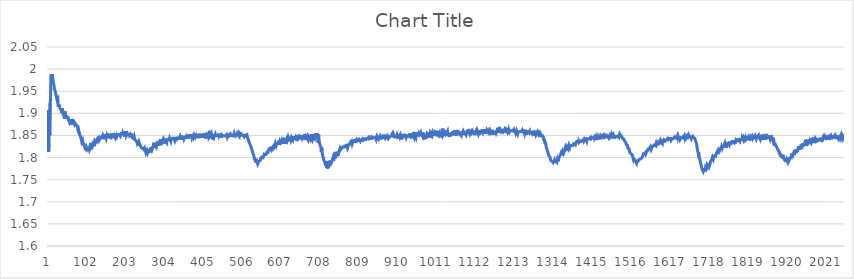
| Category | Series 0 |
|---|---|
| 0 | 1.908 |
| 1 | 1.812 |
| 2 | 1.828 |
| 3 | 1.875 |
| 4 | 1.85 |
| 5 | 1.924 |
| 6 | 1.931 |
| 7 | 1.984 |
| 8 | 1.988 |
| 9 | 1.983 |
| 10 | 1.988 |
| 11 | 1.983 |
| 12 | 1.978 |
| 13 | 1.972 |
| 14 | 1.973 |
| 15 | 1.963 |
| 16 | 1.956 |
| 17 | 1.954 |
| 18 | 1.951 |
| 19 | 1.947 |
| 20 | 1.942 |
| 21 | 1.94 |
| 22 | 1.934 |
| 23 | 1.931 |
| 24 | 1.931 |
| 25 | 1.933 |
| 26 | 1.915 |
| 27 | 1.92 |
| 28 | 1.922 |
| 29 | 1.916 |
| 30 | 1.916 |
| 31 | 1.911 |
| 32 | 1.909 |
| 33 | 1.91 |
| 34 | 1.907 |
| 35 | 1.908 |
| 36 | 1.901 |
| 37 | 1.911 |
| 38 | 1.9 |
| 39 | 1.901 |
| 40 | 1.9 |
| 41 | 1.894 |
| 42 | 1.888 |
| 43 | 1.904 |
| 44 | 1.9 |
| 45 | 1.902 |
| 46 | 1.891 |
| 47 | 1.891 |
| 48 | 1.891 |
| 49 | 1.892 |
| 50 | 1.887 |
| 51 | 1.892 |
| 52 | 1.891 |
| 53 | 1.884 |
| 54 | 1.886 |
| 55 | 1.881 |
| 56 | 1.878 |
| 57 | 1.878 |
| 58 | 1.881 |
| 59 | 1.887 |
| 60 | 1.887 |
| 61 | 1.875 |
| 62 | 1.876 |
| 63 | 1.887 |
| 64 | 1.884 |
| 65 | 1.881 |
| 66 | 1.88 |
| 67 | 1.879 |
| 68 | 1.876 |
| 69 | 1.879 |
| 70 | 1.88 |
| 71 | 1.876 |
| 72 | 1.874 |
| 73 | 1.873 |
| 74 | 1.873 |
| 75 | 1.871 |
| 76 | 1.87 |
| 77 | 1.862 |
| 78 | 1.86 |
| 79 | 1.862 |
| 80 | 1.858 |
| 81 | 1.857 |
| 82 | 1.852 |
| 83 | 1.85 |
| 84 | 1.846 |
| 85 | 1.843 |
| 86 | 1.841 |
| 87 | 1.836 |
| 88 | 1.834 |
| 89 | 1.839 |
| 90 | 1.837 |
| 91 | 1.828 |
| 92 | 1.832 |
| 93 | 1.828 |
| 94 | 1.826 |
| 95 | 1.826 |
| 96 | 1.82 |
| 97 | 1.82 |
| 98 | 1.82 |
| 99 | 1.817 |
| 100 | 1.821 |
| 101 | 1.819 |
| 102 | 1.817 |
| 103 | 1.82 |
| 104 | 1.818 |
| 105 | 1.819 |
| 106 | 1.822 |
| 107 | 1.818 |
| 108 | 1.82 |
| 109 | 1.826 |
| 110 | 1.833 |
| 111 | 1.818 |
| 112 | 1.827 |
| 113 | 1.83 |
| 114 | 1.833 |
| 115 | 1.824 |
| 116 | 1.828 |
| 117 | 1.836 |
| 118 | 1.832 |
| 119 | 1.833 |
| 120 | 1.837 |
| 121 | 1.836 |
| 122 | 1.833 |
| 123 | 1.837 |
| 124 | 1.836 |
| 125 | 1.839 |
| 126 | 1.839 |
| 127 | 1.842 |
| 128 | 1.839 |
| 129 | 1.84 |
| 130 | 1.837 |
| 131 | 1.844 |
| 132 | 1.84 |
| 133 | 1.84 |
| 134 | 1.843 |
| 135 | 1.845 |
| 136 | 1.844 |
| 137 | 1.846 |
| 138 | 1.846 |
| 139 | 1.847 |
| 140 | 1.849 |
| 141 | 1.846 |
| 142 | 1.842 |
| 143 | 1.848 |
| 144 | 1.846 |
| 145 | 1.844 |
| 146 | 1.852 |
| 147 | 1.849 |
| 148 | 1.849 |
| 149 | 1.849 |
| 150 | 1.843 |
| 151 | 1.847 |
| 152 | 1.85 |
| 153 | 1.848 |
| 154 | 1.854 |
| 155 | 1.853 |
| 156 | 1.847 |
| 157 | 1.845 |
| 158 | 1.847 |
| 159 | 1.846 |
| 160 | 1.844 |
| 161 | 1.845 |
| 162 | 1.845 |
| 163 | 1.85 |
| 164 | 1.851 |
| 165 | 1.85 |
| 166 | 1.848 |
| 167 | 1.852 |
| 168 | 1.853 |
| 169 | 1.85 |
| 170 | 1.853 |
| 171 | 1.85 |
| 172 | 1.85 |
| 173 | 1.846 |
| 174 | 1.854 |
| 175 | 1.848 |
| 176 | 1.849 |
| 177 | 1.851 |
| 178 | 1.848 |
| 179 | 1.851 |
| 180 | 1.853 |
| 181 | 1.849 |
| 182 | 1.852 |
| 183 | 1.851 |
| 184 | 1.85 |
| 185 | 1.851 |
| 186 | 1.852 |
| 187 | 1.848 |
| 188 | 1.851 |
| 189 | 1.856 |
| 190 | 1.851 |
| 191 | 1.858 |
| 192 | 1.852 |
| 193 | 1.856 |
| 194 | 1.856 |
| 195 | 1.851 |
| 196 | 1.856 |
| 197 | 1.85 |
| 198 | 1.847 |
| 199 | 1.86 |
| 200 | 1.852 |
| 201 | 1.856 |
| 202 | 1.86 |
| 203 | 1.85 |
| 204 | 1.849 |
| 205 | 1.853 |
| 206 | 1.853 |
| 207 | 1.849 |
| 208 | 1.856 |
| 209 | 1.85 |
| 210 | 1.856 |
| 211 | 1.851 |
| 212 | 1.852 |
| 213 | 1.853 |
| 214 | 1.855 |
| 215 | 1.85 |
| 216 | 1.854 |
| 217 | 1.848 |
| 218 | 1.849 |
| 219 | 1.849 |
| 220 | 1.848 |
| 221 | 1.841 |
| 222 | 1.842 |
| 223 | 1.847 |
| 224 | 1.843 |
| 225 | 1.84 |
| 226 | 1.84 |
| 227 | 1.838 |
| 228 | 1.837 |
| 229 | 1.839 |
| 230 | 1.835 |
| 231 | 1.832 |
| 232 | 1.834 |
| 233 | 1.834 |
| 234 | 1.836 |
| 235 | 1.831 |
| 236 | 1.827 |
| 237 | 1.831 |
| 238 | 1.829 |
| 239 | 1.828 |
| 240 | 1.825 |
| 241 | 1.822 |
| 242 | 1.824 |
| 243 | 1.822 |
| 244 | 1.821 |
| 245 | 1.822 |
| 246 | 1.821 |
| 247 | 1.819 |
| 248 | 1.821 |
| 249 | 1.822 |
| 250 | 1.814 |
| 251 | 1.818 |
| 252 | 1.816 |
| 253 | 1.812 |
| 254 | 1.816 |
| 255 | 1.817 |
| 256 | 1.815 |
| 257 | 1.81 |
| 258 | 1.814 |
| 259 | 1.812 |
| 260 | 1.813 |
| 261 | 1.814 |
| 262 | 1.82 |
| 263 | 1.811 |
| 264 | 1.813 |
| 265 | 1.819 |
| 266 | 1.819 |
| 267 | 1.817 |
| 268 | 1.817 |
| 269 | 1.824 |
| 270 | 1.819 |
| 271 | 1.821 |
| 272 | 1.824 |
| 273 | 1.829 |
| 274 | 1.833 |
| 275 | 1.823 |
| 276 | 1.83 |
| 277 | 1.827 |
| 278 | 1.826 |
| 279 | 1.829 |
| 280 | 1.823 |
| 281 | 1.828 |
| 282 | 1.836 |
| 283 | 1.831 |
| 284 | 1.834 |
| 285 | 1.827 |
| 286 | 1.838 |
| 287 | 1.827 |
| 288 | 1.83 |
| 289 | 1.83 |
| 290 | 1.831 |
| 291 | 1.842 |
| 292 | 1.828 |
| 293 | 1.831 |
| 294 | 1.84 |
| 295 | 1.835 |
| 296 | 1.833 |
| 297 | 1.838 |
| 298 | 1.841 |
| 299 | 1.837 |
| 300 | 1.832 |
| 301 | 1.835 |
| 302 | 1.838 |
| 303 | 1.833 |
| 304 | 1.838 |
| 305 | 1.836 |
| 306 | 1.838 |
| 307 | 1.834 |
| 308 | 1.84 |
| 309 | 1.842 |
| 310 | 1.842 |
| 311 | 1.842 |
| 312 | 1.84 |
| 313 | 1.842 |
| 314 | 1.84 |
| 315 | 1.844 |
| 316 | 1.844 |
| 317 | 1.844 |
| 318 | 1.837 |
| 319 | 1.842 |
| 320 | 1.842 |
| 321 | 1.842 |
| 322 | 1.843 |
| 323 | 1.845 |
| 324 | 1.843 |
| 325 | 1.844 |
| 326 | 1.843 |
| 327 | 1.841 |
| 328 | 1.839 |
| 329 | 1.842 |
| 330 | 1.842 |
| 331 | 1.842 |
| 332 | 1.84 |
| 333 | 1.844 |
| 334 | 1.847 |
| 335 | 1.843 |
| 336 | 1.844 |
| 337 | 1.844 |
| 338 | 1.844 |
| 339 | 1.841 |
| 340 | 1.844 |
| 341 | 1.845 |
| 342 | 1.848 |
| 343 | 1.849 |
| 344 | 1.842 |
| 345 | 1.85 |
| 346 | 1.846 |
| 347 | 1.848 |
| 348 | 1.84 |
| 349 | 1.845 |
| 350 | 1.849 |
| 351 | 1.848 |
| 352 | 1.842 |
| 353 | 1.84 |
| 354 | 1.843 |
| 355 | 1.849 |
| 356 | 1.843 |
| 357 | 1.844 |
| 358 | 1.847 |
| 359 | 1.848 |
| 360 | 1.843 |
| 361 | 1.85 |
| 362 | 1.849 |
| 363 | 1.843 |
| 364 | 1.852 |
| 365 | 1.846 |
| 366 | 1.849 |
| 367 | 1.849 |
| 368 | 1.849 |
| 369 | 1.849 |
| 370 | 1.853 |
| 371 | 1.848 |
| 372 | 1.851 |
| 373 | 1.844 |
| 374 | 1.846 |
| 375 | 1.846 |
| 376 | 1.849 |
| 377 | 1.846 |
| 378 | 1.849 |
| 379 | 1.846 |
| 380 | 1.843 |
| 381 | 1.851 |
| 382 | 1.847 |
| 383 | 1.847 |
| 384 | 1.851 |
| 385 | 1.853 |
| 386 | 1.848 |
| 387 | 1.848 |
| 388 | 1.85 |
| 389 | 1.847 |
| 390 | 1.853 |
| 391 | 1.844 |
| 392 | 1.854 |
| 393 | 1.844 |
| 394 | 1.851 |
| 395 | 1.845 |
| 396 | 1.853 |
| 397 | 1.849 |
| 398 | 1.849 |
| 399 | 1.847 |
| 400 | 1.849 |
| 401 | 1.845 |
| 402 | 1.85 |
| 403 | 1.85 |
| 404 | 1.851 |
| 405 | 1.848 |
| 406 | 1.855 |
| 407 | 1.855 |
| 408 | 1.844 |
| 409 | 1.848 |
| 410 | 1.849 |
| 411 | 1.852 |
| 412 | 1.852 |
| 413 | 1.85 |
| 414 | 1.85 |
| 415 | 1.853 |
| 416 | 1.847 |
| 417 | 1.845 |
| 418 | 1.847 |
| 419 | 1.853 |
| 420 | 1.849 |
| 421 | 1.851 |
| 422 | 1.85 |
| 423 | 1.854 |
| 424 | 1.848 |
| 425 | 1.852 |
| 426 | 1.85 |
| 427 | 1.841 |
| 428 | 1.852 |
| 429 | 1.853 |
| 430 | 1.847 |
| 431 | 1.85 |
| 432 | 1.849 |
| 433 | 1.853 |
| 434 | 1.849 |
| 435 | 1.85 |
| 436 | 1.847 |
| 437 | 1.85 |
| 438 | 1.851 |
| 439 | 1.852 |
| 440 | 1.851 |
| 441 | 1.848 |
| 442 | 1.853 |
| 443 | 1.848 |
| 444 | 1.849 |
| 445 | 1.851 |
| 446 | 1.851 |
| 447 | 1.852 |
| 448 | 1.852 |
| 449 | 1.845 |
| 450 | 1.849 |
| 451 | 1.851 |
| 452 | 1.85 |
| 453 | 1.85 |
| 454 | 1.851 |
| 455 | 1.85 |
| 456 | 1.849 |
| 457 | 1.851 |
| 458 | 1.85 |
| 459 | 1.849 |
| 460 | 1.848 |
| 461 | 1.851 |
| 462 | 1.852 |
| 463 | 1.85 |
| 464 | 1.846 |
| 465 | 1.847 |
| 466 | 1.851 |
| 467 | 1.851 |
| 468 | 1.851 |
| 469 | 1.852 |
| 470 | 1.85 |
| 471 | 1.849 |
| 472 | 1.852 |
| 473 | 1.847 |
| 474 | 1.85 |
| 475 | 1.851 |
| 476 | 1.852 |
| 477 | 1.85 |
| 478 | 1.852 |
| 479 | 1.848 |
| 480 | 1.849 |
| 481 | 1.852 |
| 482 | 1.855 |
| 483 | 1.852 |
| 484 | 1.85 |
| 485 | 1.85 |
| 486 | 1.849 |
| 487 | 1.85 |
| 488 | 1.851 |
| 489 | 1.853 |
| 490 | 1.849 |
| 491 | 1.853 |
| 492 | 1.851 |
| 493 | 1.85 |
| 494 | 1.852 |
| 495 | 1.848 |
| 496 | 1.854 |
| 497 | 1.853 |
| 498 | 1.851 |
| 499 | 1.853 |
| 500 | 1.854 |
| 501 | 1.854 |
| 502 | 1.854 |
| 503 | 1.85 |
| 504 | 1.851 |
| 505 | 1.85 |
| 506 | 1.85 |
| 507 | 1.85 |
| 508 | 1.848 |
| 509 | 1.85 |
| 510 | 1.851 |
| 511 | 1.85 |
| 512 | 1.851 |
| 513 | 1.852 |
| 514 | 1.851 |
| 515 | 1.852 |
| 516 | 1.846 |
| 517 | 1.845 |
| 518 | 1.847 |
| 519 | 1.84 |
| 520 | 1.838 |
| 521 | 1.84 |
| 522 | 1.833 |
| 523 | 1.832 |
| 524 | 1.831 |
| 525 | 1.826 |
| 526 | 1.825 |
| 527 | 1.821 |
| 528 | 1.82 |
| 529 | 1.815 |
| 530 | 1.813 |
| 531 | 1.809 |
| 532 | 1.807 |
| 533 | 1.804 |
| 534 | 1.8 |
| 535 | 1.796 |
| 536 | 1.796 |
| 537 | 1.792 |
| 538 | 1.794 |
| 539 | 1.791 |
| 540 | 1.794 |
| 541 | 1.794 |
| 542 | 1.794 |
| 543 | 1.785 |
| 544 | 1.785 |
| 545 | 1.79 |
| 546 | 1.79 |
| 547 | 1.792 |
| 548 | 1.79 |
| 549 | 1.794 |
| 550 | 1.794 |
| 551 | 1.798 |
| 552 | 1.799 |
| 553 | 1.796 |
| 554 | 1.801 |
| 555 | 1.8 |
| 556 | 1.8 |
| 557 | 1.8 |
| 558 | 1.8 |
| 559 | 1.801 |
| 560 | 1.808 |
| 561 | 1.807 |
| 562 | 1.807 |
| 563 | 1.807 |
| 564 | 1.807 |
| 565 | 1.807 |
| 566 | 1.808 |
| 567 | 1.809 |
| 568 | 1.814 |
| 569 | 1.81 |
| 570 | 1.814 |
| 571 | 1.816 |
| 572 | 1.819 |
| 573 | 1.819 |
| 574 | 1.818 |
| 575 | 1.821 |
| 576 | 1.82 |
| 577 | 1.819 |
| 578 | 1.824 |
| 579 | 1.822 |
| 580 | 1.819 |
| 581 | 1.821 |
| 582 | 1.823 |
| 583 | 1.823 |
| 584 | 1.826 |
| 585 | 1.823 |
| 586 | 1.825 |
| 587 | 1.824 |
| 588 | 1.829 |
| 589 | 1.832 |
| 590 | 1.833 |
| 591 | 1.827 |
| 592 | 1.826 |
| 593 | 1.833 |
| 594 | 1.829 |
| 595 | 1.835 |
| 596 | 1.831 |
| 597 | 1.828 |
| 598 | 1.836 |
| 599 | 1.839 |
| 600 | 1.829 |
| 601 | 1.837 |
| 602 | 1.836 |
| 603 | 1.834 |
| 604 | 1.836 |
| 605 | 1.838 |
| 606 | 1.834 |
| 607 | 1.838 |
| 608 | 1.831 |
| 609 | 1.845 |
| 610 | 1.84 |
| 611 | 1.838 |
| 612 | 1.84 |
| 613 | 1.835 |
| 614 | 1.831 |
| 615 | 1.837 |
| 616 | 1.834 |
| 617 | 1.841 |
| 618 | 1.842 |
| 619 | 1.84 |
| 620 | 1.846 |
| 621 | 1.84 |
| 622 | 1.84 |
| 623 | 1.844 |
| 624 | 1.842 |
| 625 | 1.841 |
| 626 | 1.837 |
| 627 | 1.843 |
| 628 | 1.841 |
| 629 | 1.846 |
| 630 | 1.84 |
| 631 | 1.842 |
| 632 | 1.843 |
| 633 | 1.842 |
| 634 | 1.84 |
| 635 | 1.848 |
| 636 | 1.842 |
| 637 | 1.847 |
| 638 | 1.844 |
| 639 | 1.84 |
| 640 | 1.843 |
| 641 | 1.843 |
| 642 | 1.847 |
| 643 | 1.846 |
| 644 | 1.844 |
| 645 | 1.837 |
| 646 | 1.848 |
| 647 | 1.84 |
| 648 | 1.84 |
| 649 | 1.846 |
| 650 | 1.852 |
| 651 | 1.846 |
| 652 | 1.842 |
| 653 | 1.85 |
| 654 | 1.847 |
| 655 | 1.848 |
| 656 | 1.846 |
| 657 | 1.843 |
| 658 | 1.846 |
| 659 | 1.847 |
| 660 | 1.846 |
| 661 | 1.844 |
| 662 | 1.85 |
| 663 | 1.847 |
| 664 | 1.84 |
| 665 | 1.853 |
| 666 | 1.855 |
| 667 | 1.847 |
| 668 | 1.846 |
| 669 | 1.846 |
| 670 | 1.844 |
| 671 | 1.845 |
| 672 | 1.846 |
| 673 | 1.84 |
| 674 | 1.849 |
| 675 | 1.847 |
| 676 | 1.846 |
| 677 | 1.848 |
| 678 | 1.846 |
| 679 | 1.842 |
| 680 | 1.844 |
| 681 | 1.852 |
| 682 | 1.846 |
| 683 | 1.853 |
| 684 | 1.842 |
| 685 | 1.84 |
| 686 | 1.842 |
| 687 | 1.853 |
| 688 | 1.849 |
| 689 | 1.851 |
| 690 | 1.847 |
| 691 | 1.844 |
| 692 | 1.847 |
| 693 | 1.855 |
| 694 | 1.853 |
| 695 | 1.846 |
| 696 | 1.845 |
| 697 | 1.855 |
| 698 | 1.848 |
| 699 | 1.852 |
| 700 | 1.834 |
| 701 | 1.852 |
| 702 | 1.834 |
| 703 | 1.834 |
| 704 | 1.831 |
| 705 | 1.826 |
| 706 | 1.827 |
| 707 | 1.824 |
| 708 | 1.812 |
| 709 | 1.822 |
| 710 | 1.814 |
| 711 | 1.805 |
| 712 | 1.805 |
| 713 | 1.801 |
| 714 | 1.796 |
| 715 | 1.797 |
| 716 | 1.794 |
| 717 | 1.79 |
| 718 | 1.788 |
| 719 | 1.789 |
| 720 | 1.781 |
| 721 | 1.785 |
| 722 | 1.777 |
| 723 | 1.792 |
| 724 | 1.775 |
| 725 | 1.778 |
| 726 | 1.783 |
| 727 | 1.778 |
| 728 | 1.784 |
| 729 | 1.781 |
| 730 | 1.793 |
| 731 | 1.784 |
| 732 | 1.787 |
| 733 | 1.789 |
| 734 | 1.794 |
| 735 | 1.791 |
| 736 | 1.789 |
| 737 | 1.79 |
| 738 | 1.798 |
| 739 | 1.802 |
| 740 | 1.8 |
| 741 | 1.799 |
| 742 | 1.806 |
| 743 | 1.797 |
| 744 | 1.813 |
| 745 | 1.807 |
| 746 | 1.807 |
| 747 | 1.804 |
| 748 | 1.804 |
| 749 | 1.804 |
| 750 | 1.807 |
| 751 | 1.804 |
| 752 | 1.814 |
| 753 | 1.812 |
| 754 | 1.814 |
| 755 | 1.814 |
| 756 | 1.82 |
| 757 | 1.816 |
| 758 | 1.817 |
| 759 | 1.819 |
| 760 | 1.817 |
| 761 | 1.818 |
| 762 | 1.823 |
| 763 | 1.824 |
| 764 | 1.822 |
| 765 | 1.823 |
| 766 | 1.822 |
| 767 | 1.825 |
| 768 | 1.824 |
| 769 | 1.828 |
| 770 | 1.822 |
| 771 | 1.827 |
| 772 | 1.827 |
| 773 | 1.825 |
| 774 | 1.828 |
| 775 | 1.828 |
| 776 | 1.822 |
| 777 | 1.824 |
| 778 | 1.828 |
| 779 | 1.83 |
| 780 | 1.829 |
| 781 | 1.83 |
| 782 | 1.832 |
| 783 | 1.831 |
| 784 | 1.835 |
| 785 | 1.835 |
| 786 | 1.832 |
| 787 | 1.834 |
| 788 | 1.83 |
| 789 | 1.833 |
| 790 | 1.839 |
| 791 | 1.833 |
| 792 | 1.838 |
| 793 | 1.839 |
| 794 | 1.838 |
| 795 | 1.839 |
| 796 | 1.833 |
| 797 | 1.837 |
| 798 | 1.837 |
| 799 | 1.84 |
| 800 | 1.837 |
| 801 | 1.838 |
| 802 | 1.838 |
| 803 | 1.838 |
| 804 | 1.839 |
| 805 | 1.839 |
| 806 | 1.841 |
| 807 | 1.843 |
| 808 | 1.842 |
| 809 | 1.837 |
| 810 | 1.839 |
| 811 | 1.84 |
| 812 | 1.838 |
| 813 | 1.84 |
| 814 | 1.839 |
| 815 | 1.842 |
| 816 | 1.84 |
| 817 | 1.839 |
| 818 | 1.841 |
| 819 | 1.841 |
| 820 | 1.842 |
| 821 | 1.841 |
| 822 | 1.84 |
| 823 | 1.842 |
| 824 | 1.845 |
| 825 | 1.842 |
| 826 | 1.844 |
| 827 | 1.841 |
| 828 | 1.844 |
| 829 | 1.844 |
| 830 | 1.844 |
| 831 | 1.846 |
| 832 | 1.842 |
| 833 | 1.844 |
| 834 | 1.842 |
| 835 | 1.844 |
| 836 | 1.844 |
| 837 | 1.844 |
| 838 | 1.843 |
| 839 | 1.846 |
| 840 | 1.846 |
| 841 | 1.847 |
| 842 | 1.844 |
| 843 | 1.844 |
| 844 | 1.846 |
| 845 | 1.845 |
| 846 | 1.845 |
| 847 | 1.845 |
| 848 | 1.846 |
| 849 | 1.846 |
| 850 | 1.841 |
| 851 | 1.844 |
| 852 | 1.842 |
| 853 | 1.847 |
| 854 | 1.846 |
| 855 | 1.846 |
| 856 | 1.842 |
| 857 | 1.846 |
| 858 | 1.85 |
| 859 | 1.842 |
| 860 | 1.848 |
| 861 | 1.841 |
| 862 | 1.848 |
| 863 | 1.848 |
| 864 | 1.845 |
| 865 | 1.846 |
| 866 | 1.846 |
| 867 | 1.848 |
| 868 | 1.846 |
| 869 | 1.847 |
| 870 | 1.845 |
| 871 | 1.848 |
| 872 | 1.847 |
| 873 | 1.844 |
| 874 | 1.845 |
| 875 | 1.845 |
| 876 | 1.852 |
| 877 | 1.846 |
| 878 | 1.846 |
| 879 | 1.848 |
| 880 | 1.843 |
| 881 | 1.847 |
| 882 | 1.847 |
| 883 | 1.844 |
| 884 | 1.844 |
| 885 | 1.844 |
| 886 | 1.847 |
| 887 | 1.846 |
| 888 | 1.847 |
| 889 | 1.849 |
| 890 | 1.851 |
| 891 | 1.85 |
| 892 | 1.854 |
| 893 | 1.847 |
| 894 | 1.846 |
| 895 | 1.851 |
| 896 | 1.847 |
| 897 | 1.846 |
| 898 | 1.849 |
| 899 | 1.847 |
| 900 | 1.848 |
| 901 | 1.848 |
| 902 | 1.847 |
| 903 | 1.849 |
| 904 | 1.852 |
| 905 | 1.849 |
| 906 | 1.846 |
| 907 | 1.847 |
| 908 | 1.845 |
| 909 | 1.847 |
| 910 | 1.848 |
| 911 | 1.848 |
| 912 | 1.851 |
| 913 | 1.845 |
| 914 | 1.846 |
| 915 | 1.848 |
| 916 | 1.85 |
| 917 | 1.841 |
| 918 | 1.848 |
| 919 | 1.847 |
| 920 | 1.848 |
| 921 | 1.848 |
| 922 | 1.854 |
| 923 | 1.846 |
| 924 | 1.849 |
| 925 | 1.851 |
| 926 | 1.85 |
| 927 | 1.85 |
| 928 | 1.846 |
| 929 | 1.849 |
| 930 | 1.85 |
| 931 | 1.851 |
| 932 | 1.849 |
| 933 | 1.851 |
| 934 | 1.85 |
| 935 | 1.849 |
| 936 | 1.846 |
| 937 | 1.854 |
| 938 | 1.853 |
| 939 | 1.846 |
| 940 | 1.849 |
| 941 | 1.844 |
| 942 | 1.849 |
| 943 | 1.846 |
| 944 | 1.854 |
| 945 | 1.852 |
| 946 | 1.848 |
| 947 | 1.858 |
| 948 | 1.848 |
| 949 | 1.846 |
| 950 | 1.85 |
| 951 | 1.852 |
| 952 | 1.851 |
| 953 | 1.846 |
| 954 | 1.856 |
| 955 | 1.851 |
| 956 | 1.852 |
| 957 | 1.856 |
| 958 | 1.848 |
| 959 | 1.85 |
| 960 | 1.852 |
| 961 | 1.855 |
| 962 | 1.853 |
| 963 | 1.852 |
| 964 | 1.854 |
| 965 | 1.856 |
| 966 | 1.85 |
| 967 | 1.854 |
| 968 | 1.854 |
| 969 | 1.852 |
| 970 | 1.849 |
| 971 | 1.856 |
| 972 | 1.856 |
| 973 | 1.852 |
| 974 | 1.841 |
| 975 | 1.851 |
| 976 | 1.851 |
| 977 | 1.843 |
| 978 | 1.849 |
| 979 | 1.843 |
| 980 | 1.847 |
| 981 | 1.848 |
| 982 | 1.854 |
| 983 | 1.854 |
| 984 | 1.852 |
| 985 | 1.85 |
| 986 | 1.845 |
| 987 | 1.857 |
| 988 | 1.853 |
| 989 | 1.85 |
| 990 | 1.846 |
| 991 | 1.855 |
| 992 | 1.854 |
| 993 | 1.856 |
| 994 | 1.85 |
| 995 | 1.855 |
| 996 | 1.857 |
| 997 | 1.854 |
| 998 | 1.857 |
| 999 | 1.849 |
| 1000 | 1.849 |
| 1001 | 1.855 |
| 1002 | 1.852 |
| 1003 | 1.85 |
| 1004 | 1.848 |
| 1005 | 1.861 |
| 1006 | 1.849 |
| 1007 | 1.859 |
| 1008 | 1.855 |
| 1009 | 1.854 |
| 1010 | 1.848 |
| 1011 | 1.854 |
| 1012 | 1.852 |
| 1013 | 1.854 |
| 1014 | 1.857 |
| 1015 | 1.85 |
| 1016 | 1.85 |
| 1017 | 1.853 |
| 1018 | 1.858 |
| 1019 | 1.846 |
| 1020 | 1.85 |
| 1021 | 1.854 |
| 1022 | 1.856 |
| 1023 | 1.866 |
| 1024 | 1.85 |
| 1025 | 1.852 |
| 1026 | 1.852 |
| 1027 | 1.854 |
| 1028 | 1.861 |
| 1029 | 1.851 |
| 1030 | 1.85 |
| 1031 | 1.859 |
| 1032 | 1.855 |
| 1033 | 1.857 |
| 1034 | 1.854 |
| 1035 | 1.86 |
| 1036 | 1.851 |
| 1037 | 1.855 |
| 1038 | 1.849 |
| 1039 | 1.854 |
| 1040 | 1.851 |
| 1041 | 1.846 |
| 1042 | 1.855 |
| 1043 | 1.85 |
| 1044 | 1.855 |
| 1045 | 1.857 |
| 1046 | 1.857 |
| 1047 | 1.856 |
| 1048 | 1.853 |
| 1049 | 1.855 |
| 1050 | 1.854 |
| 1051 | 1.853 |
| 1052 | 1.85 |
| 1053 | 1.861 |
| 1054 | 1.852 |
| 1055 | 1.861 |
| 1056 | 1.855 |
| 1057 | 1.86 |
| 1058 | 1.85 |
| 1059 | 1.852 |
| 1060 | 1.857 |
| 1061 | 1.859 |
| 1062 | 1.86 |
| 1063 | 1.859 |
| 1064 | 1.858 |
| 1065 | 1.856 |
| 1066 | 1.857 |
| 1067 | 1.853 |
| 1068 | 1.852 |
| 1069 | 1.858 |
| 1070 | 1.852 |
| 1071 | 1.856 |
| 1072 | 1.853 |
| 1073 | 1.856 |
| 1074 | 1.858 |
| 1075 | 1.859 |
| 1076 | 1.852 |
| 1077 | 1.858 |
| 1078 | 1.857 |
| 1079 | 1.858 |
| 1080 | 1.856 |
| 1081 | 1.854 |
| 1082 | 1.856 |
| 1083 | 1.851 |
| 1084 | 1.855 |
| 1085 | 1.853 |
| 1086 | 1.86 |
| 1087 | 1.861 |
| 1088 | 1.86 |
| 1089 | 1.861 |
| 1090 | 1.859 |
| 1091 | 1.857 |
| 1092 | 1.855 |
| 1093 | 1.86 |
| 1094 | 1.857 |
| 1095 | 1.858 |
| 1096 | 1.86 |
| 1097 | 1.861 |
| 1098 | 1.856 |
| 1099 | 1.854 |
| 1100 | 1.86 |
| 1101 | 1.859 |
| 1102 | 1.855 |
| 1103 | 1.86 |
| 1104 | 1.854 |
| 1105 | 1.856 |
| 1106 | 1.854 |
| 1107 | 1.853 |
| 1108 | 1.856 |
| 1109 | 1.861 |
| 1110 | 1.861 |
| 1111 | 1.864 |
| 1112 | 1.861 |
| 1113 | 1.859 |
| 1114 | 1.86 |
| 1115 | 1.853 |
| 1116 | 1.852 |
| 1117 | 1.859 |
| 1118 | 1.852 |
| 1119 | 1.862 |
| 1120 | 1.86 |
| 1121 | 1.86 |
| 1122 | 1.858 |
| 1123 | 1.86 |
| 1124 | 1.859 |
| 1125 | 1.858 |
| 1126 | 1.856 |
| 1127 | 1.86 |
| 1128 | 1.857 |
| 1129 | 1.863 |
| 1130 | 1.854 |
| 1131 | 1.864 |
| 1132 | 1.858 |
| 1133 | 1.863 |
| 1134 | 1.854 |
| 1135 | 1.857 |
| 1136 | 1.86 |
| 1137 | 1.863 |
| 1138 | 1.861 |
| 1139 | 1.86 |
| 1140 | 1.86 |
| 1141 | 1.857 |
| 1142 | 1.858 |
| 1143 | 1.862 |
| 1144 | 1.862 |
| 1145 | 1.858 |
| 1146 | 1.86 |
| 1147 | 1.858 |
| 1148 | 1.856 |
| 1149 | 1.859 |
| 1150 | 1.857 |
| 1151 | 1.86 |
| 1152 | 1.863 |
| 1153 | 1.852 |
| 1154 | 1.857 |
| 1155 | 1.856 |
| 1156 | 1.858 |
| 1157 | 1.856 |
| 1158 | 1.857 |
| 1159 | 1.857 |
| 1160 | 1.858 |
| 1161 | 1.855 |
| 1162 | 1.858 |
| 1163 | 1.856 |
| 1164 | 1.858 |
| 1165 | 1.867 |
| 1166 | 1.858 |
| 1167 | 1.864 |
| 1168 | 1.856 |
| 1169 | 1.866 |
| 1170 | 1.869 |
| 1171 | 1.859 |
| 1172 | 1.862 |
| 1173 | 1.863 |
| 1174 | 1.858 |
| 1175 | 1.86 |
| 1176 | 1.86 |
| 1177 | 1.861 |
| 1178 | 1.863 |
| 1179 | 1.858 |
| 1180 | 1.859 |
| 1181 | 1.86 |
| 1182 | 1.862 |
| 1183 | 1.856 |
| 1184 | 1.86 |
| 1185 | 1.857 |
| 1186 | 1.867 |
| 1187 | 1.857 |
| 1188 | 1.861 |
| 1189 | 1.863 |
| 1190 | 1.861 |
| 1191 | 1.856 |
| 1192 | 1.858 |
| 1193 | 1.86 |
| 1194 | 1.863 |
| 1195 | 1.861 |
| 1196 | 1.858 |
| 1197 | 1.859 |
| 1198 | 1.861 |
| 1199 | 1.863 |
| 1200 | 1.863 |
| 1201 | 1.861 |
| 1202 | 1.861 |
| 1203 | 1.86 |
| 1204 | 1.86 |
| 1205 | 1.86 |
| 1206 | 1.858 |
| 1207 | 1.864 |
| 1208 | 1.863 |
| 1209 | 1.858 |
| 1210 | 1.862 |
| 1211 | 1.863 |
| 1212 | 1.856 |
| 1213 | 1.859 |
| 1214 | 1.861 |
| 1215 | 1.858 |
| 1216 | 1.858 |
| 1217 | 1.854 |
| 1218 | 1.858 |
| 1219 | 1.856 |
| 1220 | 1.859 |
| 1221 | 1.858 |
| 1222 | 1.858 |
| 1223 | 1.856 |
| 1224 | 1.86 |
| 1225 | 1.858 |
| 1226 | 1.858 |
| 1227 | 1.858 |
| 1228 | 1.86 |
| 1229 | 1.862 |
| 1230 | 1.859 |
| 1231 | 1.859 |
| 1232 | 1.857 |
| 1233 | 1.86 |
| 1234 | 1.856 |
| 1235 | 1.854 |
| 1236 | 1.857 |
| 1237 | 1.863 |
| 1238 | 1.858 |
| 1239 | 1.855 |
| 1240 | 1.852 |
| 1241 | 1.86 |
| 1242 | 1.855 |
| 1243 | 1.861 |
| 1244 | 1.857 |
| 1245 | 1.858 |
| 1246 | 1.857 |
| 1247 | 1.855 |
| 1248 | 1.855 |
| 1249 | 1.859 |
| 1250 | 1.857 |
| 1251 | 1.856 |
| 1252 | 1.858 |
| 1253 | 1.856 |
| 1254 | 1.855 |
| 1255 | 1.853 |
| 1256 | 1.854 |
| 1257 | 1.857 |
| 1258 | 1.856 |
| 1259 | 1.854 |
| 1260 | 1.855 |
| 1261 | 1.857 |
| 1262 | 1.857 |
| 1263 | 1.852 |
| 1264 | 1.856 |
| 1265 | 1.853 |
| 1266 | 1.853 |
| 1267 | 1.853 |
| 1268 | 1.858 |
| 1269 | 1.856 |
| 1270 | 1.854 |
| 1271 | 1.853 |
| 1272 | 1.861 |
| 1273 | 1.85 |
| 1274 | 1.858 |
| 1275 | 1.85 |
| 1276 | 1.855 |
| 1277 | 1.847 |
| 1278 | 1.851 |
| 1279 | 1.847 |
| 1280 | 1.852 |
| 1281 | 1.848 |
| 1282 | 1.848 |
| 1283 | 1.847 |
| 1284 | 1.845 |
| 1285 | 1.838 |
| 1286 | 1.841 |
| 1287 | 1.837 |
| 1288 | 1.832 |
| 1289 | 1.836 |
| 1290 | 1.829 |
| 1291 | 1.824 |
| 1292 | 1.823 |
| 1293 | 1.819 |
| 1294 | 1.818 |
| 1295 | 1.813 |
| 1296 | 1.813 |
| 1297 | 1.806 |
| 1298 | 1.804 |
| 1299 | 1.806 |
| 1300 | 1.802 |
| 1301 | 1.801 |
| 1302 | 1.795 |
| 1303 | 1.793 |
| 1304 | 1.792 |
| 1305 | 1.794 |
| 1306 | 1.792 |
| 1307 | 1.791 |
| 1308 | 1.79 |
| 1309 | 1.789 |
| 1310 | 1.787 |
| 1311 | 1.787 |
| 1312 | 1.794 |
| 1313 | 1.789 |
| 1314 | 1.792 |
| 1315 | 1.792 |
| 1316 | 1.793 |
| 1317 | 1.79 |
| 1318 | 1.795 |
| 1319 | 1.793 |
| 1320 | 1.797 |
| 1321 | 1.795 |
| 1322 | 1.792 |
| 1323 | 1.796 |
| 1324 | 1.798 |
| 1325 | 1.802 |
| 1326 | 1.802 |
| 1327 | 1.8 |
| 1328 | 1.807 |
| 1329 | 1.809 |
| 1330 | 1.806 |
| 1331 | 1.81 |
| 1332 | 1.805 |
| 1333 | 1.81 |
| 1334 | 1.813 |
| 1335 | 1.811 |
| 1336 | 1.813 |
| 1337 | 1.818 |
| 1338 | 1.815 |
| 1339 | 1.816 |
| 1340 | 1.821 |
| 1341 | 1.818 |
| 1342 | 1.819 |
| 1343 | 1.82 |
| 1344 | 1.823 |
| 1345 | 1.821 |
| 1346 | 1.821 |
| 1347 | 1.823 |
| 1348 | 1.821 |
| 1349 | 1.822 |
| 1350 | 1.828 |
| 1351 | 1.828 |
| 1352 | 1.823 |
| 1353 | 1.827 |
| 1354 | 1.83 |
| 1355 | 1.826 |
| 1356 | 1.83 |
| 1357 | 1.825 |
| 1358 | 1.83 |
| 1359 | 1.826 |
| 1360 | 1.829 |
| 1361 | 1.83 |
| 1362 | 1.831 |
| 1363 | 1.833 |
| 1364 | 1.833 |
| 1365 | 1.832 |
| 1366 | 1.831 |
| 1367 | 1.83 |
| 1368 | 1.832 |
| 1369 | 1.833 |
| 1370 | 1.838 |
| 1371 | 1.834 |
| 1372 | 1.834 |
| 1373 | 1.839 |
| 1374 | 1.834 |
| 1375 | 1.837 |
| 1376 | 1.834 |
| 1377 | 1.836 |
| 1378 | 1.834 |
| 1379 | 1.837 |
| 1380 | 1.836 |
| 1381 | 1.837 |
| 1382 | 1.836 |
| 1383 | 1.837 |
| 1384 | 1.837 |
| 1385 | 1.839 |
| 1386 | 1.837 |
| 1387 | 1.84 |
| 1388 | 1.842 |
| 1389 | 1.838 |
| 1390 | 1.84 |
| 1391 | 1.841 |
| 1392 | 1.84 |
| 1393 | 1.841 |
| 1394 | 1.842 |
| 1395 | 1.841 |
| 1396 | 1.838 |
| 1397 | 1.842 |
| 1398 | 1.841 |
| 1399 | 1.841 |
| 1400 | 1.842 |
| 1401 | 1.842 |
| 1402 | 1.84 |
| 1403 | 1.843 |
| 1404 | 1.845 |
| 1405 | 1.844 |
| 1406 | 1.845 |
| 1407 | 1.842 |
| 1408 | 1.842 |
| 1409 | 1.844 |
| 1410 | 1.845 |
| 1411 | 1.846 |
| 1412 | 1.844 |
| 1413 | 1.844 |
| 1414 | 1.843 |
| 1415 | 1.846 |
| 1416 | 1.843 |
| 1417 | 1.843 |
| 1418 | 1.846 |
| 1419 | 1.843 |
| 1420 | 1.841 |
| 1421 | 1.843 |
| 1422 | 1.842 |
| 1423 | 1.847 |
| 1424 | 1.844 |
| 1425 | 1.842 |
| 1426 | 1.848 |
| 1427 | 1.843 |
| 1428 | 1.846 |
| 1429 | 1.844 |
| 1430 | 1.841 |
| 1431 | 1.847 |
| 1432 | 1.844 |
| 1433 | 1.849 |
| 1434 | 1.848 |
| 1435 | 1.846 |
| 1436 | 1.847 |
| 1437 | 1.845 |
| 1438 | 1.85 |
| 1439 | 1.847 |
| 1440 | 1.846 |
| 1441 | 1.846 |
| 1442 | 1.85 |
| 1443 | 1.846 |
| 1444 | 1.845 |
| 1445 | 1.847 |
| 1446 | 1.847 |
| 1447 | 1.846 |
| 1448 | 1.85 |
| 1449 | 1.849 |
| 1450 | 1.847 |
| 1451 | 1.847 |
| 1452 | 1.849 |
| 1453 | 1.844 |
| 1454 | 1.844 |
| 1455 | 1.845 |
| 1456 | 1.851 |
| 1457 | 1.849 |
| 1458 | 1.848 |
| 1459 | 1.848 |
| 1460 | 1.853 |
| 1461 | 1.849 |
| 1462 | 1.851 |
| 1463 | 1.847 |
| 1464 | 1.846 |
| 1465 | 1.85 |
| 1466 | 1.846 |
| 1467 | 1.845 |
| 1468 | 1.846 |
| 1469 | 1.846 |
| 1470 | 1.848 |
| 1471 | 1.846 |
| 1472 | 1.846 |
| 1473 | 1.848 |
| 1474 | 1.85 |
| 1475 | 1.846 |
| 1476 | 1.847 |
| 1477 | 1.845 |
| 1478 | 1.849 |
| 1479 | 1.85 |
| 1480 | 1.848 |
| 1481 | 1.851 |
| 1482 | 1.847 |
| 1483 | 1.852 |
| 1484 | 1.853 |
| 1485 | 1.85 |
| 1486 | 1.848 |
| 1487 | 1.849 |
| 1488 | 1.846 |
| 1489 | 1.843 |
| 1490 | 1.843 |
| 1491 | 1.845 |
| 1492 | 1.842 |
| 1493 | 1.84 |
| 1494 | 1.838 |
| 1495 | 1.836 |
| 1496 | 1.836 |
| 1497 | 1.834 |
| 1498 | 1.831 |
| 1499 | 1.829 |
| 1500 | 1.83 |
| 1501 | 1.828 |
| 1502 | 1.827 |
| 1503 | 1.821 |
| 1504 | 1.822 |
| 1505 | 1.821 |
| 1506 | 1.819 |
| 1507 | 1.815 |
| 1508 | 1.811 |
| 1509 | 1.812 |
| 1510 | 1.809 |
| 1511 | 1.808 |
| 1512 | 1.807 |
| 1513 | 1.81 |
| 1514 | 1.806 |
| 1515 | 1.802 |
| 1516 | 1.8 |
| 1517 | 1.796 |
| 1518 | 1.799 |
| 1519 | 1.793 |
| 1520 | 1.795 |
| 1521 | 1.793 |
| 1522 | 1.793 |
| 1523 | 1.795 |
| 1524 | 1.792 |
| 1525 | 1.787 |
| 1526 | 1.792 |
| 1527 | 1.791 |
| 1528 | 1.794 |
| 1529 | 1.792 |
| 1530 | 1.794 |
| 1531 | 1.795 |
| 1532 | 1.794 |
| 1533 | 1.796 |
| 1534 | 1.796 |
| 1535 | 1.795 |
| 1536 | 1.797 |
| 1537 | 1.799 |
| 1538 | 1.799 |
| 1539 | 1.799 |
| 1540 | 1.798 |
| 1541 | 1.804 |
| 1542 | 1.804 |
| 1543 | 1.809 |
| 1544 | 1.808 |
| 1545 | 1.807 |
| 1546 | 1.809 |
| 1547 | 1.81 |
| 1548 | 1.811 |
| 1549 | 1.808 |
| 1550 | 1.811 |
| 1551 | 1.814 |
| 1552 | 1.813 |
| 1553 | 1.815 |
| 1554 | 1.816 |
| 1555 | 1.819 |
| 1556 | 1.819 |
| 1557 | 1.819 |
| 1558 | 1.819 |
| 1559 | 1.821 |
| 1560 | 1.823 |
| 1561 | 1.824 |
| 1562 | 1.822 |
| 1563 | 1.825 |
| 1564 | 1.822 |
| 1565 | 1.825 |
| 1566 | 1.826 |
| 1567 | 1.826 |
| 1568 | 1.826 |
| 1569 | 1.827 |
| 1570 | 1.827 |
| 1571 | 1.828 |
| 1572 | 1.83 |
| 1573 | 1.83 |
| 1574 | 1.827 |
| 1575 | 1.827 |
| 1576 | 1.833 |
| 1577 | 1.83 |
| 1578 | 1.833 |
| 1579 | 1.832 |
| 1580 | 1.832 |
| 1581 | 1.831 |
| 1582 | 1.835 |
| 1583 | 1.833 |
| 1584 | 1.832 |
| 1585 | 1.83 |
| 1586 | 1.837 |
| 1587 | 1.839 |
| 1588 | 1.839 |
| 1589 | 1.836 |
| 1590 | 1.836 |
| 1591 | 1.836 |
| 1592 | 1.832 |
| 1593 | 1.841 |
| 1594 | 1.834 |
| 1595 | 1.839 |
| 1596 | 1.834 |
| 1597 | 1.84 |
| 1598 | 1.84 |
| 1599 | 1.838 |
| 1600 | 1.838 |
| 1601 | 1.84 |
| 1602 | 1.84 |
| 1603 | 1.84 |
| 1604 | 1.841 |
| 1605 | 1.84 |
| 1606 | 1.843 |
| 1607 | 1.843 |
| 1608 | 1.84 |
| 1609 | 1.84 |
| 1610 | 1.841 |
| 1611 | 1.843 |
| 1612 | 1.842 |
| 1613 | 1.842 |
| 1614 | 1.843 |
| 1615 | 1.839 |
| 1616 | 1.84 |
| 1617 | 1.842 |
| 1618 | 1.841 |
| 1619 | 1.843 |
| 1620 | 1.843 |
| 1621 | 1.841 |
| 1622 | 1.845 |
| 1623 | 1.846 |
| 1624 | 1.842 |
| 1625 | 1.846 |
| 1626 | 1.845 |
| 1627 | 1.844 |
| 1628 | 1.846 |
| 1629 | 1.841 |
| 1630 | 1.844 |
| 1631 | 1.847 |
| 1632 | 1.844 |
| 1633 | 1.847 |
| 1634 | 1.844 |
| 1635 | 1.845 |
| 1636 | 1.846 |
| 1637 | 1.845 |
| 1638 | 1.841 |
| 1639 | 1.843 |
| 1640 | 1.844 |
| 1641 | 1.846 |
| 1642 | 1.844 |
| 1643 | 1.845 |
| 1644 | 1.844 |
| 1645 | 1.845 |
| 1646 | 1.844 |
| 1647 | 1.851 |
| 1648 | 1.845 |
| 1649 | 1.848 |
| 1650 | 1.844 |
| 1651 | 1.848 |
| 1652 | 1.848 |
| 1653 | 1.843 |
| 1654 | 1.842 |
| 1655 | 1.843 |
| 1656 | 1.849 |
| 1657 | 1.85 |
| 1658 | 1.846 |
| 1659 | 1.844 |
| 1660 | 1.851 |
| 1661 | 1.85 |
| 1662 | 1.848 |
| 1663 | 1.846 |
| 1664 | 1.846 |
| 1665 | 1.847 |
| 1666 | 1.846 |
| 1667 | 1.842 |
| 1668 | 1.845 |
| 1669 | 1.846 |
| 1670 | 1.846 |
| 1671 | 1.848 |
| 1672 | 1.847 |
| 1673 | 1.846 |
| 1674 | 1.847 |
| 1675 | 1.845 |
| 1676 | 1.844 |
| 1677 | 1.843 |
| 1678 | 1.842 |
| 1679 | 1.836 |
| 1680 | 1.835 |
| 1681 | 1.829 |
| 1682 | 1.822 |
| 1683 | 1.823 |
| 1684 | 1.821 |
| 1685 | 1.81 |
| 1686 | 1.812 |
| 1687 | 1.803 |
| 1688 | 1.802 |
| 1689 | 1.798 |
| 1690 | 1.796 |
| 1691 | 1.788 |
| 1692 | 1.785 |
| 1693 | 1.782 |
| 1694 | 1.777 |
| 1695 | 1.776 |
| 1696 | 1.777 |
| 1697 | 1.771 |
| 1698 | 1.776 |
| 1699 | 1.774 |
| 1700 | 1.77 |
| 1701 | 1.771 |
| 1702 | 1.772 |
| 1703 | 1.773 |
| 1704 | 1.778 |
| 1705 | 1.776 |
| 1706 | 1.774 |
| 1707 | 1.777 |
| 1708 | 1.783 |
| 1709 | 1.783 |
| 1710 | 1.78 |
| 1711 | 1.778 |
| 1712 | 1.788 |
| 1713 | 1.784 |
| 1714 | 1.781 |
| 1715 | 1.784 |
| 1716 | 1.787 |
| 1717 | 1.791 |
| 1718 | 1.79 |
| 1719 | 1.79 |
| 1720 | 1.796 |
| 1721 | 1.794 |
| 1722 | 1.801 |
| 1723 | 1.802 |
| 1724 | 1.797 |
| 1725 | 1.801 |
| 1726 | 1.802 |
| 1727 | 1.803 |
| 1728 | 1.804 |
| 1729 | 1.8 |
| 1730 | 1.806 |
| 1731 | 1.807 |
| 1732 | 1.808 |
| 1733 | 1.811 |
| 1734 | 1.811 |
| 1735 | 1.815 |
| 1736 | 1.808 |
| 1737 | 1.815 |
| 1738 | 1.815 |
| 1739 | 1.815 |
| 1740 | 1.815 |
| 1741 | 1.819 |
| 1742 | 1.821 |
| 1743 | 1.819 |
| 1744 | 1.822 |
| 1745 | 1.819 |
| 1746 | 1.824 |
| 1747 | 1.821 |
| 1748 | 1.824 |
| 1749 | 1.824 |
| 1750 | 1.824 |
| 1751 | 1.825 |
| 1752 | 1.826 |
| 1753 | 1.826 |
| 1754 | 1.832 |
| 1755 | 1.831 |
| 1756 | 1.825 |
| 1757 | 1.834 |
| 1758 | 1.823 |
| 1759 | 1.833 |
| 1760 | 1.828 |
| 1761 | 1.831 |
| 1762 | 1.827 |
| 1763 | 1.832 |
| 1764 | 1.834 |
| 1765 | 1.829 |
| 1766 | 1.836 |
| 1767 | 1.834 |
| 1768 | 1.834 |
| 1769 | 1.828 |
| 1770 | 1.834 |
| 1771 | 1.835 |
| 1772 | 1.836 |
| 1773 | 1.835 |
| 1774 | 1.838 |
| 1775 | 1.835 |
| 1776 | 1.837 |
| 1777 | 1.836 |
| 1778 | 1.833 |
| 1779 | 1.839 |
| 1780 | 1.831 |
| 1781 | 1.836 |
| 1782 | 1.835 |
| 1783 | 1.84 |
| 1784 | 1.842 |
| 1785 | 1.838 |
| 1786 | 1.835 |
| 1787 | 1.84 |
| 1788 | 1.839 |
| 1789 | 1.838 |
| 1790 | 1.841 |
| 1791 | 1.84 |
| 1792 | 1.842 |
| 1793 | 1.837 |
| 1794 | 1.84 |
| 1795 | 1.839 |
| 1796 | 1.841 |
| 1797 | 1.841 |
| 1798 | 1.839 |
| 1799 | 1.845 |
| 1800 | 1.843 |
| 1801 | 1.844 |
| 1802 | 1.84 |
| 1803 | 1.844 |
| 1804 | 1.841 |
| 1805 | 1.843 |
| 1806 | 1.844 |
| 1807 | 1.841 |
| 1808 | 1.844 |
| 1809 | 1.841 |
| 1810 | 1.84 |
| 1811 | 1.84 |
| 1812 | 1.844 |
| 1813 | 1.843 |
| 1814 | 1.844 |
| 1815 | 1.847 |
| 1816 | 1.842 |
| 1817 | 1.844 |
| 1818 | 1.842 |
| 1819 | 1.841 |
| 1820 | 1.85 |
| 1821 | 1.844 |
| 1822 | 1.842 |
| 1823 | 1.846 |
| 1824 | 1.845 |
| 1825 | 1.843 |
| 1826 | 1.846 |
| 1827 | 1.844 |
| 1828 | 1.846 |
| 1829 | 1.844 |
| 1830 | 1.846 |
| 1831 | 1.845 |
| 1832 | 1.849 |
| 1833 | 1.846 |
| 1834 | 1.845 |
| 1835 | 1.842 |
| 1836 | 1.846 |
| 1837 | 1.844 |
| 1838 | 1.848 |
| 1839 | 1.85 |
| 1840 | 1.847 |
| 1841 | 1.851 |
| 1842 | 1.846 |
| 1843 | 1.846 |
| 1844 | 1.843 |
| 1845 | 1.85 |
| 1846 | 1.847 |
| 1847 | 1.842 |
| 1848 | 1.845 |
| 1849 | 1.847 |
| 1850 | 1.84 |
| 1851 | 1.852 |
| 1852 | 1.846 |
| 1853 | 1.847 |
| 1854 | 1.849 |
| 1855 | 1.849 |
| 1856 | 1.846 |
| 1857 | 1.847 |
| 1858 | 1.84 |
| 1859 | 1.846 |
| 1860 | 1.845 |
| 1861 | 1.854 |
| 1862 | 1.842 |
| 1863 | 1.85 |
| 1864 | 1.846 |
| 1865 | 1.85 |
| 1866 | 1.844 |
| 1867 | 1.849 |
| 1868 | 1.845 |
| 1869 | 1.85 |
| 1870 | 1.846 |
| 1871 | 1.843 |
| 1872 | 1.847 |
| 1873 | 1.85 |
| 1874 | 1.843 |
| 1875 | 1.842 |
| 1876 | 1.845 |
| 1877 | 1.844 |
| 1878 | 1.84 |
| 1879 | 1.845 |
| 1880 | 1.844 |
| 1881 | 1.838 |
| 1882 | 1.83 |
| 1883 | 1.832 |
| 1884 | 1.83 |
| 1885 | 1.83 |
| 1886 | 1.829 |
| 1887 | 1.831 |
| 1888 | 1.824 |
| 1889 | 1.824 |
| 1890 | 1.821 |
| 1891 | 1.821 |
| 1892 | 1.817 |
| 1893 | 1.815 |
| 1894 | 1.816 |
| 1895 | 1.811 |
| 1896 | 1.811 |
| 1897 | 1.808 |
| 1898 | 1.802 |
| 1899 | 1.806 |
| 1900 | 1.805 |
| 1901 | 1.807 |
| 1902 | 1.801 |
| 1903 | 1.798 |
| 1904 | 1.803 |
| 1905 | 1.806 |
| 1906 | 1.799 |
| 1907 | 1.799 |
| 1908 | 1.796 |
| 1909 | 1.796 |
| 1910 | 1.793 |
| 1911 | 1.792 |
| 1912 | 1.793 |
| 1913 | 1.794 |
| 1914 | 1.796 |
| 1915 | 1.796 |
| 1916 | 1.792 |
| 1917 | 1.797 |
| 1918 | 1.793 |
| 1919 | 1.8 |
| 1920 | 1.793 |
| 1921 | 1.793 |
| 1922 | 1.797 |
| 1923 | 1.8 |
| 1924 | 1.798 |
| 1925 | 1.8 |
| 1926 | 1.8 |
| 1927 | 1.806 |
| 1928 | 1.807 |
| 1929 | 1.806 |
| 1930 | 1.804 |
| 1931 | 1.808 |
| 1932 | 1.806 |
| 1933 | 1.809 |
| 1934 | 1.813 |
| 1935 | 1.812 |
| 1936 | 1.811 |
| 1937 | 1.814 |
| 1938 | 1.817 |
| 1939 | 1.81 |
| 1940 | 1.816 |
| 1941 | 1.814 |
| 1942 | 1.817 |
| 1943 | 1.816 |
| 1944 | 1.817 |
| 1945 | 1.825 |
| 1946 | 1.822 |
| 1947 | 1.819 |
| 1948 | 1.824 |
| 1949 | 1.819 |
| 1950 | 1.821 |
| 1951 | 1.826 |
| 1952 | 1.827 |
| 1953 | 1.825 |
| 1954 | 1.824 |
| 1955 | 1.829 |
| 1956 | 1.832 |
| 1957 | 1.825 |
| 1958 | 1.83 |
| 1959 | 1.83 |
| 1960 | 1.829 |
| 1961 | 1.831 |
| 1962 | 1.831 |
| 1963 | 1.83 |
| 1964 | 1.84 |
| 1965 | 1.836 |
| 1966 | 1.826 |
| 1967 | 1.834 |
| 1968 | 1.832 |
| 1969 | 1.829 |
| 1970 | 1.835 |
| 1971 | 1.835 |
| 1972 | 1.835 |
| 1973 | 1.841 |
| 1974 | 1.835 |
| 1975 | 1.838 |
| 1976 | 1.837 |
| 1977 | 1.837 |
| 1978 | 1.833 |
| 1979 | 1.835 |
| 1980 | 1.843 |
| 1981 | 1.839 |
| 1982 | 1.836 |
| 1983 | 1.845 |
| 1984 | 1.84 |
| 1985 | 1.839 |
| 1986 | 1.836 |
| 1987 | 1.833 |
| 1988 | 1.839 |
| 1989 | 1.843 |
| 1990 | 1.842 |
| 1991 | 1.841 |
| 1992 | 1.837 |
| 1993 | 1.838 |
| 1994 | 1.837 |
| 1995 | 1.838 |
| 1996 | 1.844 |
| 1997 | 1.84 |
| 1998 | 1.842 |
| 1999 | 1.841 |
| 2000 | 1.841 |
| 2001 | 1.845 |
| 2002 | 1.839 |
| 2003 | 1.84 |
| 2004 | 1.84 |
| 2005 | 1.839 |
| 2006 | 1.844 |
| 2007 | 1.842 |
| 2008 | 1.842 |
| 2009 | 1.846 |
| 2010 | 1.844 |
| 2011 | 1.844 |
| 2012 | 1.847 |
| 2013 | 1.842 |
| 2014 | 1.84 |
| 2015 | 1.85 |
| 2016 | 1.848 |
| 2017 | 1.844 |
| 2018 | 1.846 |
| 2019 | 1.845 |
| 2020 | 1.846 |
| 2021 | 1.843 |
| 2022 | 1.848 |
| 2023 | 1.84 |
| 2024 | 1.843 |
| 2025 | 1.848 |
| 2026 | 1.849 |
| 2027 | 1.846 |
| 2028 | 1.85 |
| 2029 | 1.844 |
| 2030 | 1.841 |
| 2031 | 1.847 |
| 2032 | 1.85 |
| 2033 | 1.846 |
| 2034 | 1.844 |
| 2035 | 1.848 |
| 2036 | 1.845 |
| 2037 | 1.848 |
| 2038 | 1.847 |
| 2039 | 1.847 |
| 2040 | 1.852 |
| 2041 | 1.85 |
| 2042 | 1.848 |
| 2043 | 1.846 |
| 2044 | 1.842 |
| 2045 | 1.85 |
| 2046 | 1.848 |
| 2047 | 1.846 |
| 2048 | 1.844 |
| 2049 | 1.851 |
| 2050 | 1.85 |
| 2051 | 1.839 |
| 2052 | 1.849 |
| 2053 | 1.846 |
| 2054 | 1.847 |
| 2055 | 1.85 |
| 2056 | 1.845 |
| 2057 | 1.844 |
| 2058 | 1.849 |
| 2059 | 1.846 |
| 2060 | 1.843 |
| 2061 | 1.842 |
| 2062 | 1.848 |
| 2063 | 1.843 |
| 2064 | 1.847 |
| 2065 | 1.853 |